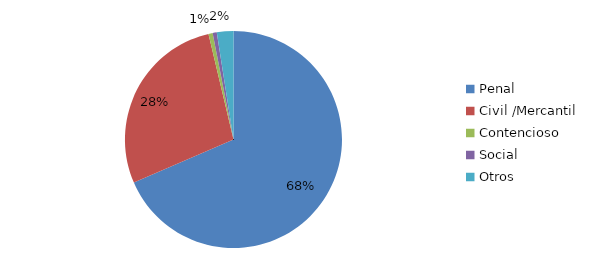
| Category | Series 0 |
|---|---|
| Penal | 111 |
| Civil /Mercantil | 45 |
| Contencioso | 1 |
| Social | 1 |
| Otros | 4 |